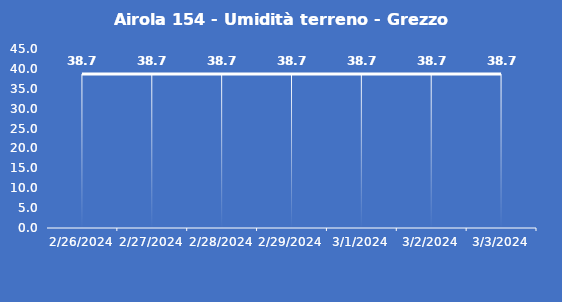
| Category | Airola 154 - Umidità terreno - Grezzo (%VWC) |
|---|---|
| 2/26/24 | 38.7 |
| 2/27/24 | 38.7 |
| 2/28/24 | 38.7 |
| 2/29/24 | 38.7 |
| 3/1/24 | 38.7 |
| 3/2/24 | 38.7 |
| 3/3/24 | 38.7 |